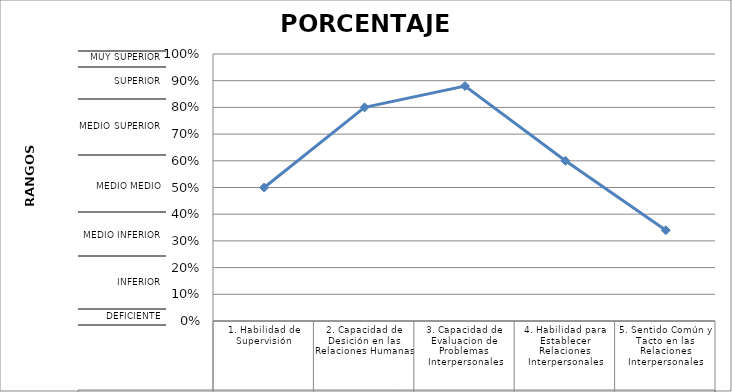
| Category | PORCENTAJE MOSS-1 |
|---|---|
| 1. Habilidad de Supervisión | 0.5 |
| 2. Capacidad de Desición en las Relaciones Humanas | 0.8 |
| 3. Capacidad de Evaluacion de Problemas Interpersonales | 0.88 |
| 4. Habilidad para Establecer Relaciones Interpersonales | 0.6 |
| 5. Sentido Común y Tacto en las Relaciones Interpersonales | 0.34 |